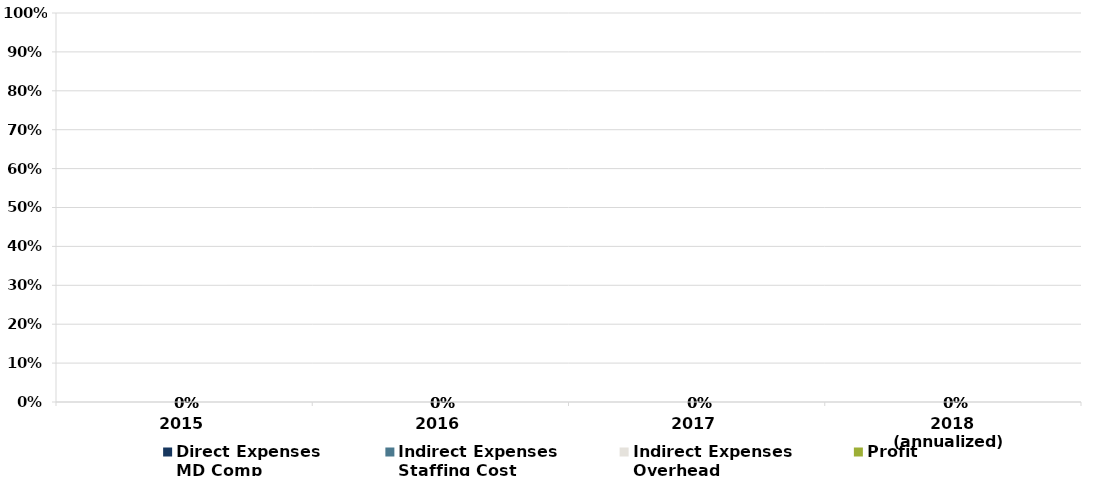
| Category | Direct Expenses 
MD Comp   | Indirect Expenses 
Staffing Cost | Indirect Expenses 
Overhead | Profit  |
|---|---|---|---|---|
| 2015 | 0 | 0 | 0 | 0 |
| 2016 | 0 | 0 | 0 | 0 |
| 2017 | 0 | 0 | 0 | 0 |
| 2018 (annualized)  | 0 | 0 | 0 | 0 |